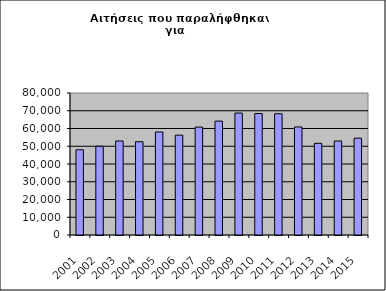
| Category | Series 1 |
|---|---|
| 2001.0 | 48010 |
| 2002.0 | 49998 |
| 2003.0 | 52964 |
| 2004.0 | 52551 |
| 2005.0 | 58046 |
| 2006.0 | 56263 |
| 2007.0 | 60792 |
| 2008.0 | 64163 |
| 2009.0 | 68694 |
| 2010.0 | 68418 |
| 2011.0 | 68310 |
| 2012.0 | 60877 |
| 2013.0 | 51662 |
| 2014.0 | 52955 |
| 2015.0 | 54542 |